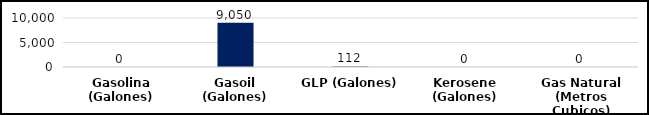
| Category | Series 0 |
|---|---|
| Gasolina (Galones) | 0 |
| Gasoil (Galones) | 9050 |
| GLP (Galones) | 112 |
| Kerosene (Galones) | 0 |
| Gas Natural (Metros Cubicos) | 0 |